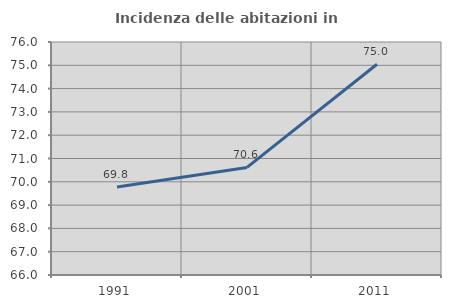
| Category | Incidenza delle abitazioni in proprietà  |
|---|---|
| 1991.0 | 69.773 |
| 2001.0 | 70.616 |
| 2011.0 | 75.045 |